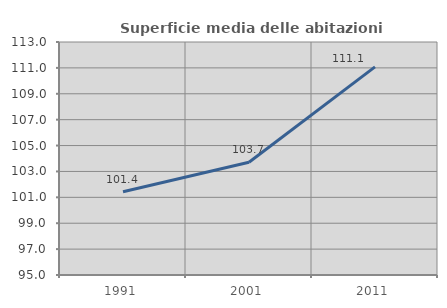
| Category | Superficie media delle abitazioni occupate |
|---|---|
| 1991.0 | 101.431 |
| 2001.0 | 103.708 |
| 2011.0 | 111.075 |